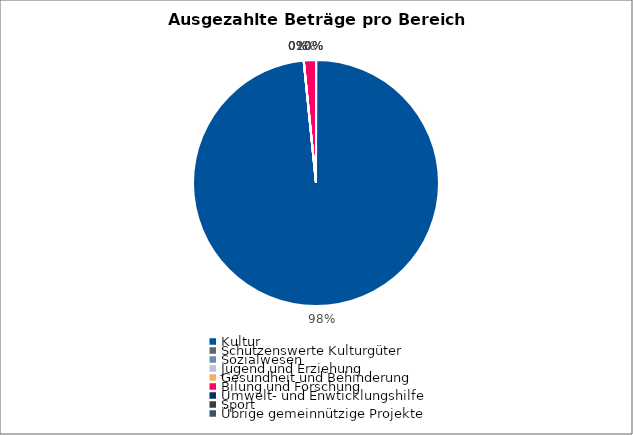
| Category | Series 0 |
|---|---|
| Kultur | 10498447.24 |
| Schützenswerte Kulturgüter | 0 |
| Sozialwesen | 0 |
| Jugend und Erziehung | 0 |
| Gesundheit und Behinderung | 0 |
| Bilung und Forschung | 170737.25 |
| Umwelt- und Enwticklungshilfe | 0 |
| Sport | 0 |
| Übrige gemeinnützige Projekte | 0 |